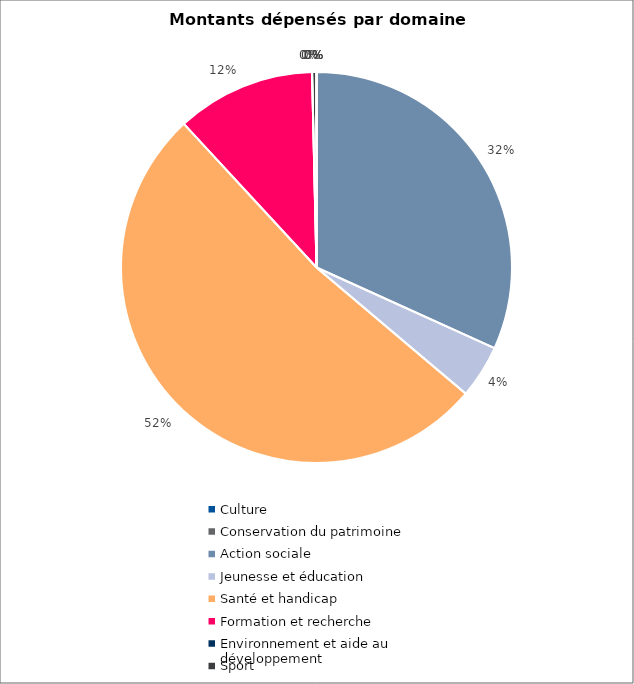
| Category | Series 0 |
|---|---|
| Culture | 0 |
| Conservation du patrimoine | 0 |
| Action sociale | 86678.35 |
| Jeunesse et éducation | 12000 |
| Santé et handicap | 141780.8 |
| Formation et recherche | 31400 |
| Environnement et aide au
développement | 0 |
| Sport | 1000 |
| Autres projets d’utilité publique | 0 |